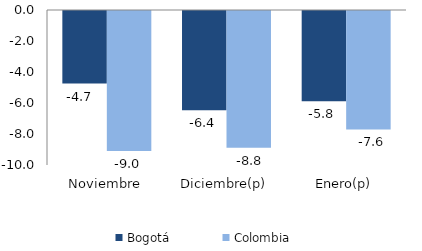
| Category | Bogotá | Colombia |
|---|---|---|
| Noviembre | -4.678 | -9.036 |
| Diciembre(p) | -6.403 | -8.819 |
| Enero(p) | -5.826 | -7.642 |